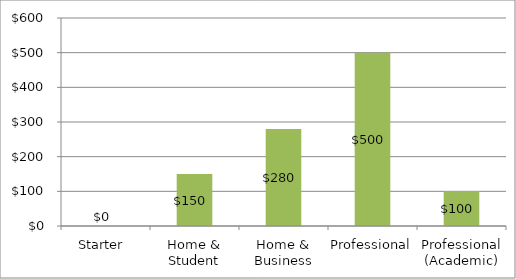
| Category | Series 0 |
|---|---|
| Starter  | 0 |
| Home & Student | 150 |
| Home & Business | 280 |
| Professional | 500 |
| Professional (Academic) | 100 |